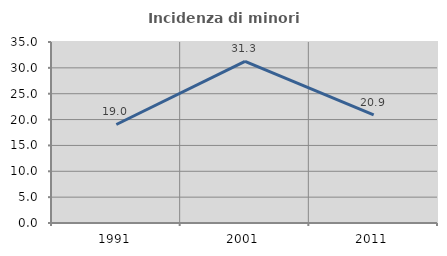
| Category | Incidenza di minori stranieri |
|---|---|
| 1991.0 | 19.048 |
| 2001.0 | 31.25 |
| 2011.0 | 20.896 |